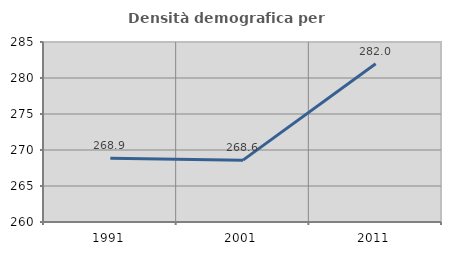
| Category | Densità demografica |
|---|---|
| 1991.0 | 268.859 |
| 2001.0 | 268.592 |
| 2011.0 | 281.989 |